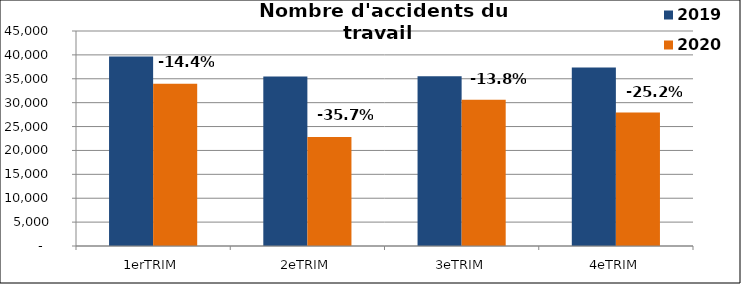
| Category | 2019 | 2020 |
|---|---|---|
| 1erTRIM | 39649 | 33943 |
| 2eTRIM | 35467 | 22800 |
| 3eTRIM | 35536 | 30615 |
| 4eTRIM | 37351 | 27941 |